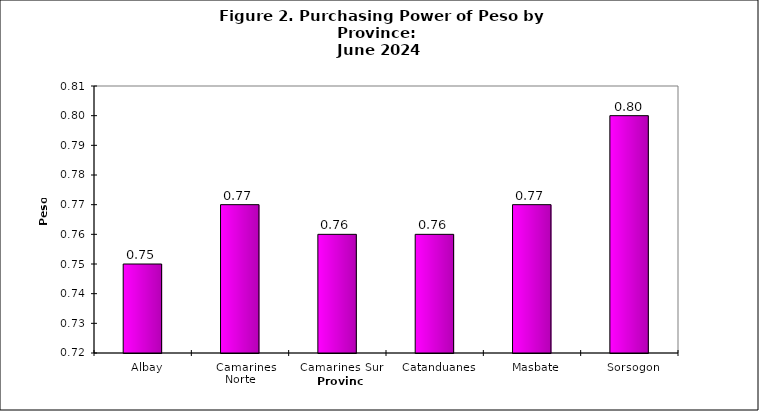
| Category | PPP |
|---|---|
|   Albay | 0.75 |
|   Camarines Norte | 0.77 |
|   Camarines Sur | 0.76 |
|   Catanduanes | 0.76 |
|   Masbate | 0.77 |
|   Sorsogon | 0.8 |